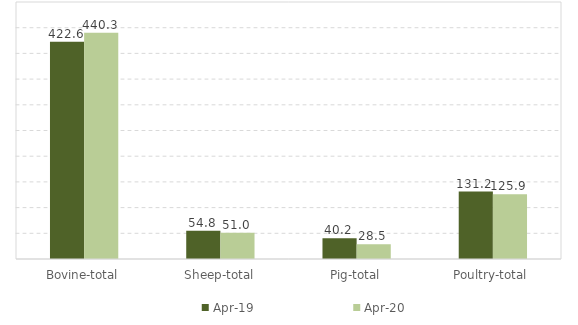
| Category | Apr-19 | Apr-20 |
|---|---|---|
| Bovine-total | 422.6 | 440.3 |
| Sheep-total | 54.8 | 51 |
| Pig-total | 40.2 | 28.5 |
| Poultry-total | 131.2 | 125.9 |